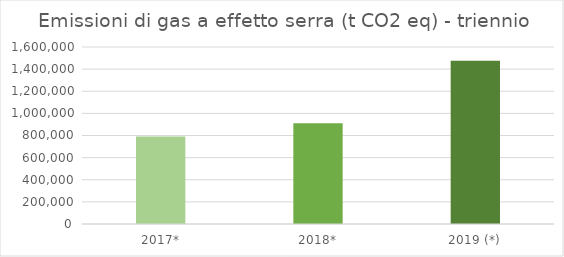
| Category | Series 0 |
|---|---|
| 2017* | 790123 |
| 2018* | 910879 |
| 2019 (*) | 1475731 |